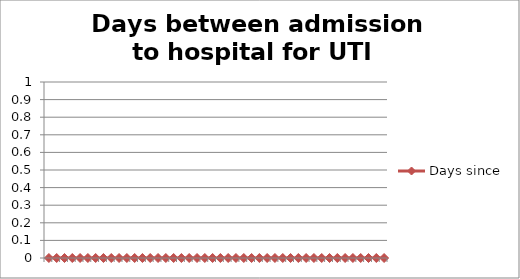
| Category | Days since |
|---|---|
|  | 0 |
|  | 0 |
|  | 0 |
|  | 0 |
|  | 0 |
|  | 0 |
|  | 0 |
|  | 0 |
|  | 0 |
|  | 0 |
|  | 0 |
|  | 0 |
|  | 0 |
|  | 0 |
|  | 0 |
|  | 0 |
|  | 0 |
|  | 0 |
|  | 0 |
|  | 0 |
|  | 0 |
|  | 0 |
|  | 0 |
|  | 0 |
|  | 0 |
|  | 0 |
|  | 0 |
|  | 0 |
|  | 0 |
|  | 0 |
|  | 0 |
|  | 0 |
|  | 0 |
|  | 0 |
|  | 0 |
|  | 0 |
|  | 0 |
|  | 0 |
|  | 0 |
|  | 0 |
|  | 0 |
|  | 0 |
|  | 0 |
|  | 0 |